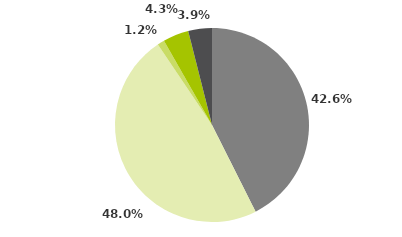
| Category | Series 0 |
|---|---|
| Multimercados Macro | 0.426 |
| Multimercados Livre | 0.48 |
| Multimercados L/S - Neutro | 0.012 |
| Multimercados L/S - Direcional | 0.043 |
| Outros | 0.039 |